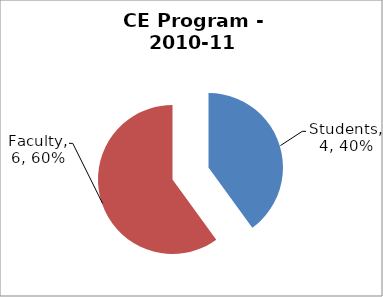
| Category | Series 0 |
|---|---|
| Students | 4 |
| Faculty | 6 |